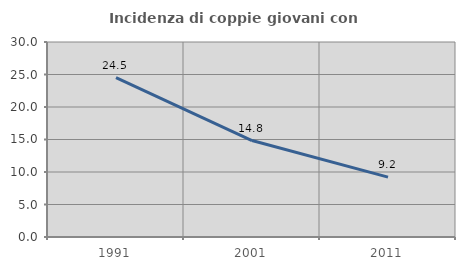
| Category | Incidenza di coppie giovani con figli |
|---|---|
| 1991.0 | 24.519 |
| 2001.0 | 14.844 |
| 2011.0 | 9.206 |